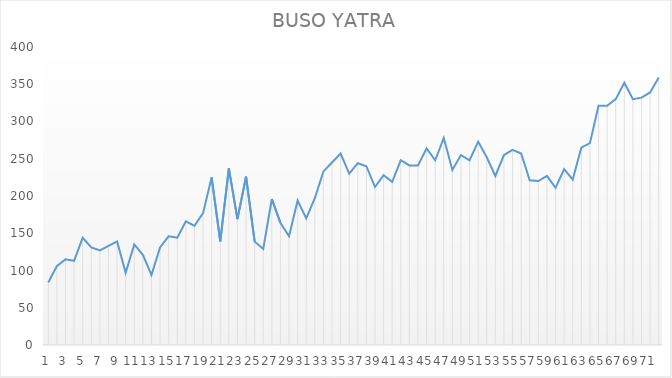
| Category | BUSO YATRA |
|---|---|
| 0 | 84 |
| 1 | 106 |
| 2 | 115 |
| 3 | 113 |
| 4 | 144 |
| 5 | 131 |
| 6 | 127 |
| 7 | 133 |
| 8 | 139 |
| 9 | 97 |
| 10 | 135 |
| 11 | 121 |
| 12 | 94 |
| 13 | 131 |
| 14 | 146 |
| 15 | 144 |
| 16 | 166 |
| 17 | 160 |
| 18 | 177 |
| 19 | 225 |
| 20 | 139 |
| 21 | 237 |
| 22 | 169 |
| 23 | 226 |
| 24 | 139 |
| 25 | 129 |
| 26 | 196 |
| 27 | 164 |
| 28 | 146 |
| 29 | 194 |
| 30 | 170 |
| 31 | 197 |
| 32 | 233 |
| 33 | 245 |
| 34 | 257 |
| 35 | 230 |
| 36 | 244 |
| 37 | 240 |
| 38 | 212 |
| 39 | 228 |
| 40 | 219 |
| 41 | 248 |
| 42 | 241 |
| 43 | 241 |
| 44 | 264 |
| 45 | 248 |
| 46 | 278 |
| 47 | 235 |
| 48 | 255 |
| 49 | 248 |
| 50 | 273 |
| 51 | 252 |
| 52 | 227 |
| 53 | 255 |
| 54 | 262 |
| 55 | 257 |
| 56 | 221 |
| 57 | 220 |
| 58 | 227 |
| 59 | 211 |
| 60 | 236 |
| 61 | 222 |
| 62 | 265 |
| 63 | 271 |
| 64 | 321 |
| 65 | 321 |
| 66 | 330 |
| 67 | 352 |
| 68 | 330 |
| 69 | 332 |
| 70 | 339 |
| 71 | 359 |